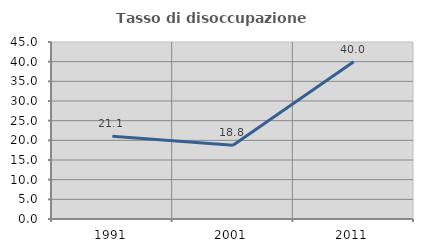
| Category | Tasso di disoccupazione giovanile  |
|---|---|
| 1991.0 | 21.053 |
| 2001.0 | 18.75 |
| 2011.0 | 40 |